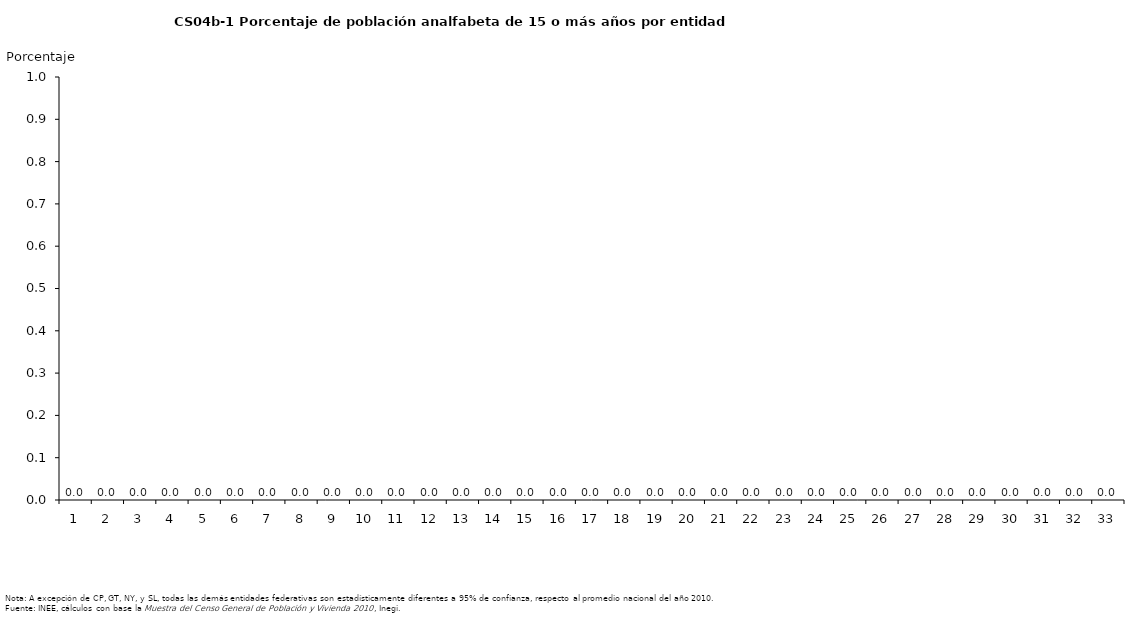
| Category | Series 1 |
|---|---|
| 0 | 2.116 |
| 1 | 2.331 |
| 2 | 2.415 |
| 3 | 2.683 |
| 4 | 2.796 |
| 5 | 2.919 |
| 6 | 2.973 |
| 7 | 3.443 |
| 8 | 3.751 |
| 9 | 3.775 |
| 10 | 4.238 |
| 11 | 4.31 |
| 12 | 4.828 |
| 13 | 5.034 |
| 14 | 5.096 |
| 15 | 5.207 |
| 16 | 5.38 |
| 17 | 6.021 |
| 18 | 6.164 |
| 19 | 6.403 |
| 20 | 6.611 |
| 21 | 6.783 |
| 22 | 7.602 |
| 23 | 8.05 |
| 24 | 8.199 |
| 25 | 9.002 |
| 26 | 9.766 |
| 27 | 9.91 |
| 28 | 10.495 |
| 29 | 11.338 |
| 30 | 16.192 |
| 31 | 16.198 |
| 32 | 18.277 |